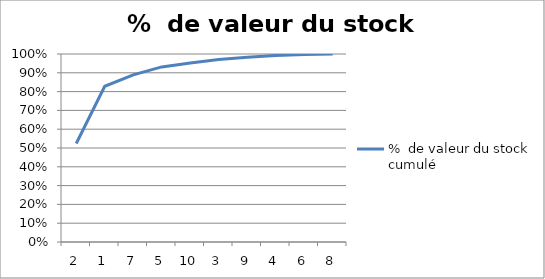
| Category | %  de valeur du stock cumulé |
|---|---|
| 2.0 | 0.524 |
| 1.0 | 0.828 |
| 7.0 | 0.889 |
| 5.0 | 0.931 |
| 10.0 | 0.952 |
| 3.0 | 0.971 |
| 9.0 | 0.982 |
| 4.0 | 0.992 |
| 6.0 | 0.997 |
| 8.0 | 1 |